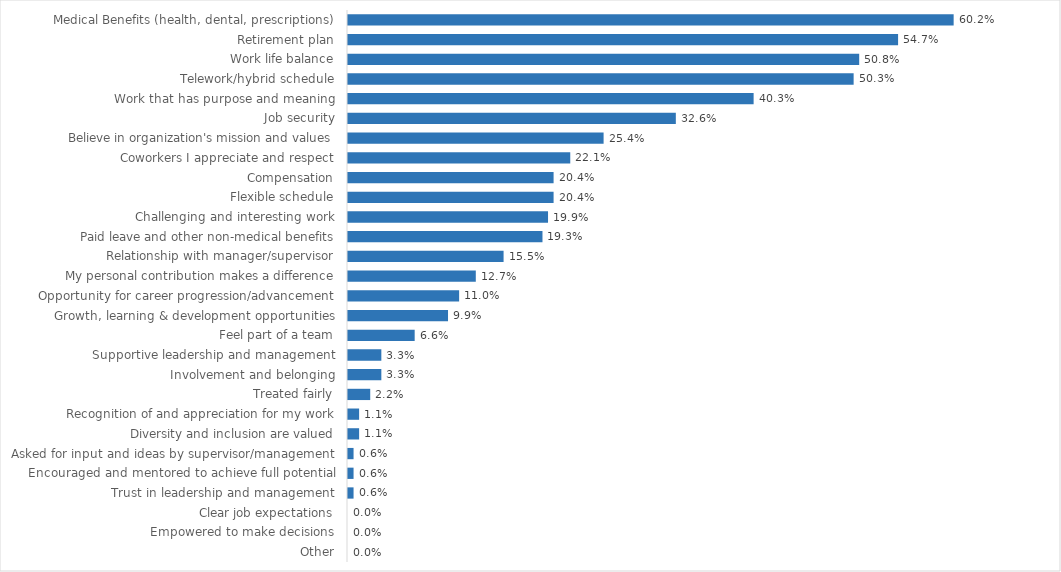
| Category | Environmental Conservation |
|---|---|
| Medical Benefits (health, dental, prescriptions) | 0.602 |
| Retirement plan | 0.547 |
| Work life balance | 0.508 |
| Telework/hybrid schedule | 0.503 |
| Work that has purpose and meaning | 0.403 |
| Job security | 0.326 |
| Believe in organization's mission and values | 0.254 |
| Coworkers I appreciate and respect | 0.221 |
| Compensation | 0.204 |
| Flexible schedule | 0.204 |
| Challenging and interesting work | 0.199 |
| Paid leave and other non-medical benefits | 0.193 |
| Relationship with manager/supervisor | 0.155 |
| My personal contribution makes a difference | 0.127 |
| Opportunity for career progression/advancement | 0.11 |
| Growth, learning & development opportunities | 0.099 |
| Feel part of a team | 0.066 |
| Supportive leadership and management | 0.033 |
| Involvement and belonging | 0.033 |
| Treated fairly | 0.022 |
| Recognition of and appreciation for my work | 0.011 |
| Diversity and inclusion are valued | 0.011 |
| Asked for input and ideas by supervisor/management | 0.006 |
| Encouraged and mentored to achieve full potential | 0.006 |
| Trust in leadership and management | 0.006 |
| Clear job expectations | 0 |
| Empowered to make decisions | 0 |
| Other | 0 |